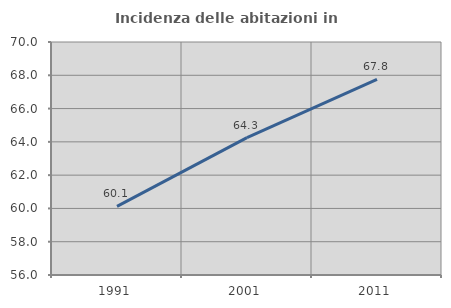
| Category | Incidenza delle abitazioni in proprietà  |
|---|---|
| 1991.0 | 60.125 |
| 2001.0 | 64.256 |
| 2011.0 | 67.755 |